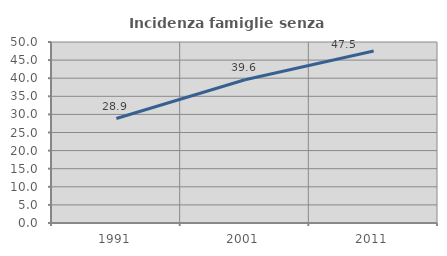
| Category | Incidenza famiglie senza nuclei |
|---|---|
| 1991.0 | 28.859 |
| 2001.0 | 39.571 |
| 2011.0 | 47.5 |